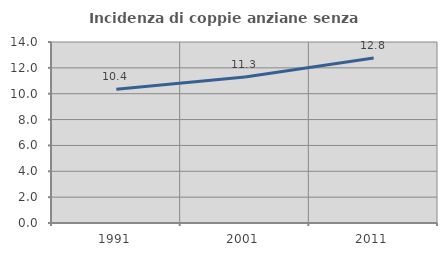
| Category | Incidenza di coppie anziane senza figli  |
|---|---|
| 1991.0 | 10.352 |
| 2001.0 | 11.297 |
| 2011.0 | 12.766 |